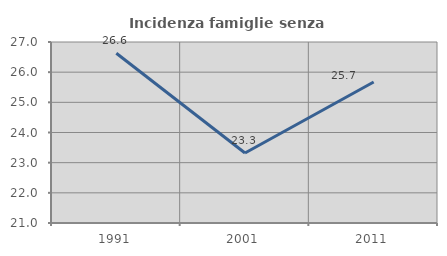
| Category | Incidenza famiglie senza nuclei |
|---|---|
| 1991.0 | 26.626 |
| 2001.0 | 23.322 |
| 2011.0 | 25.673 |